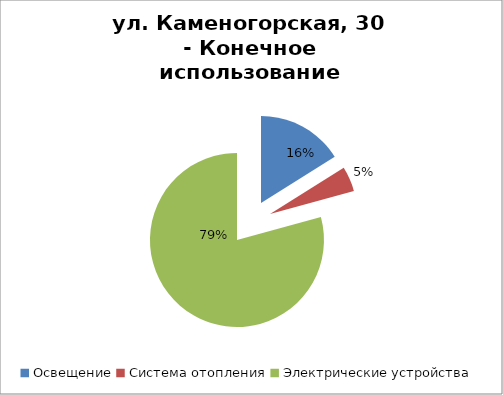
| Category | Series 0 |
|---|---|
| Освещение | 728.083 |
| Система отопления | 210 |
| Электрические устройства | 3586.631 |